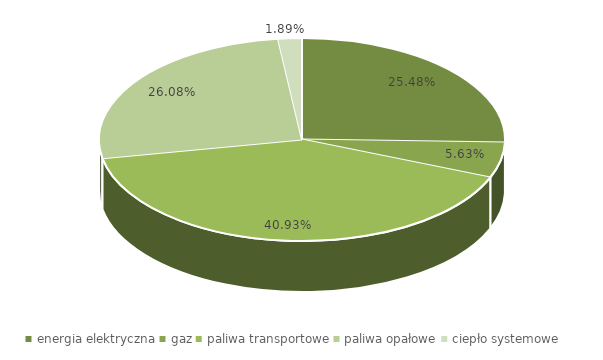
| Category | prognoza 2020 bez inwestycji oszczędnościowych |
|---|---|
| energia elektryczna | 0.255 |
| gaz | 0.056 |
| paliwa transportowe | 0.409 |
| paliwa opałowe | 0.261 |
| ciepło systemowe | 0.019 |